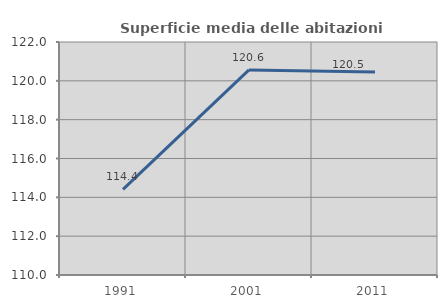
| Category | Superficie media delle abitazioni occupate |
|---|---|
| 1991.0 | 114.408 |
| 2001.0 | 120.561 |
| 2011.0 | 120.452 |